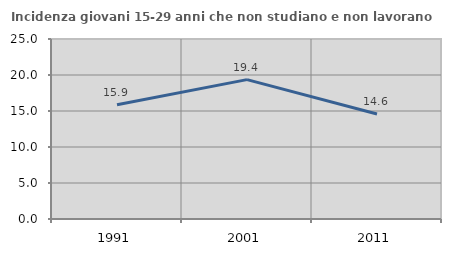
| Category | Incidenza giovani 15-29 anni che non studiano e non lavorano  |
|---|---|
| 1991.0 | 15.879 |
| 2001.0 | 19.355 |
| 2011.0 | 14.583 |